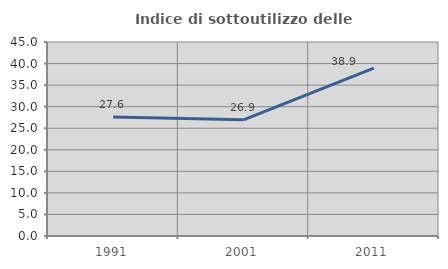
| Category | Indice di sottoutilizzo delle abitazioni  |
|---|---|
| 1991.0 | 27.586 |
| 2001.0 | 26.946 |
| 2011.0 | 38.922 |